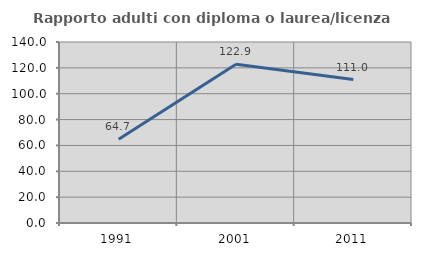
| Category | Rapporto adulti con diploma o laurea/licenza media  |
|---|---|
| 1991.0 | 64.706 |
| 2001.0 | 122.857 |
| 2011.0 | 110.959 |